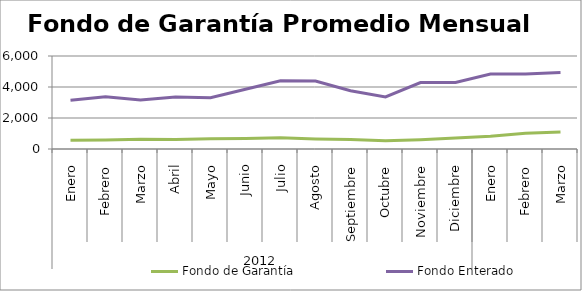
| Category | Fondo de Garantía | Fondo Enterado |
|---|---|---|
| 0 | 560.173 | 3141.641 |
| 1 | 575.916 | 3362.648 |
| 2 | 622.075 | 3154.118 |
| 3 | 612.299 | 3348.058 |
| 4 | 654.277 | 3308.859 |
| 5 | 675.965 | 3850.375 |
| 6 | 729.97 | 4400.539 |
| 7 | 649.095 | 4383.327 |
| 8 | 606.03 | 3757.632 |
| 9 | 525.314 | 3362.932 |
| 10 | 591.646 | 4285.609 |
| 11 | 703.403 | 4296.87 |
| 12 | 823.344 | 4842.786 |
| 13 | 1008.855 | 4845.136 |
| 14 | 1091.101 | 4938.365 |